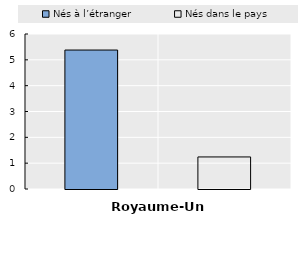
| Category | Royaume-Uni |
|---|---|
| Nés à l’étranger | 5.379 |
| Nés dans le pays | 1.241 |